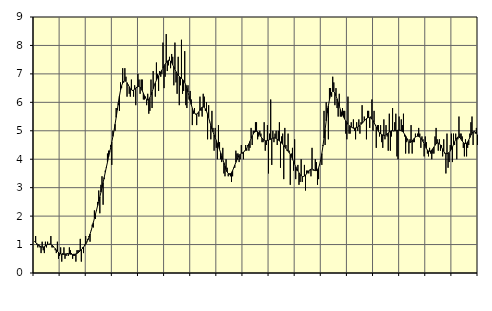
| Category | Piggar | Series 1 |
|---|---|---|
| nan | 1.1 | 1.11 |
| 87.0 | 1.3 | 1.07 |
| 87.0 | 1 | 1.04 |
| 87.0 | 0.9 | 1 |
| 87.0 | 1 | 0.97 |
| 87.0 | 0.9 | 0.95 |
| 87.0 | 0.7 | 0.92 |
| 87.0 | 1.1 | 0.91 |
| 87.0 | 0.8 | 0.91 |
| 87.0 | 0.7 | 0.93 |
| 87.0 | 1.1 | 0.95 |
| 87.0 | 0.9 | 0.98 |
| nan | 1.1 | 1 |
| 88.0 | 1 | 1.01 |
| 88.0 | 1 | 1.02 |
| 88.0 | 1.3 | 1.01 |
| 88.0 | 0.9 | 0.98 |
| 88.0 | 0.9 | 0.95 |
| 88.0 | 0.9 | 0.9 |
| 88.0 | 0.8 | 0.86 |
| 88.0 | 0.7 | 0.81 |
| 88.0 | 1.1 | 0.76 |
| 88.0 | 0.5 | 0.72 |
| 88.0 | 0.6 | 0.69 |
| nan | 0.9 | 0.67 |
| 89.0 | 0.4 | 0.66 |
| 89.0 | 0.7 | 0.65 |
| 89.0 | 0.9 | 0.66 |
| 89.0 | 0.5 | 0.67 |
| 89.0 | 0.6 | 0.67 |
| 89.0 | 0.7 | 0.68 |
| 89.0 | 0.6 | 0.68 |
| 89.0 | 0.9 | 0.67 |
| 89.0 | 0.8 | 0.66 |
| 89.0 | 0.7 | 0.66 |
| 89.0 | 0.5 | 0.65 |
| nan | 0.6 | 0.66 |
| 90.0 | 0.6 | 0.66 |
| 90.0 | 0.4 | 0.67 |
| 90.0 | 0.8 | 0.69 |
| 90.0 | 0.8 | 0.71 |
| 90.0 | 0.8 | 0.74 |
| 90.0 | 1.2 | 0.78 |
| 90.0 | 0.4 | 0.82 |
| 90.0 | 0.9 | 0.86 |
| 90.0 | 0.7 | 0.91 |
| 90.0 | 1 | 0.96 |
| 90.0 | 1.3 | 1.01 |
| nan | 1.1 | 1.08 |
| 91.0 | 1.2 | 1.16 |
| 91.0 | 1.3 | 1.26 |
| 91.0 | 1.1 | 1.37 |
| 91.0 | 1.5 | 1.49 |
| 91.0 | 1.7 | 1.63 |
| 91.0 | 1.6 | 1.77 |
| 91.0 | 2.2 | 1.92 |
| 91.0 | 1.9 | 2.07 |
| 91.0 | 2.2 | 2.22 |
| 91.0 | 2.5 | 2.37 |
| 91.0 | 2.9 | 2.52 |
| nan | 2.1 | 2.67 |
| 92.0 | 3.1 | 2.84 |
| 92.0 | 3.4 | 3.01 |
| 92.0 | 2.4 | 3.18 |
| 92.0 | 3.3 | 3.36 |
| 92.0 | 3.6 | 3.54 |
| 92.0 | 3.7 | 3.72 |
| 92.0 | 4.2 | 3.89 |
| 92.0 | 4.3 | 4.07 |
| 92.0 | 4.3 | 4.24 |
| 92.0 | 4.5 | 4.42 |
| 92.0 | 3.8 | 4.6 |
| nan | 5 | 4.8 |
| 93.0 | 5 | 5 |
| 93.0 | 5 | 5.23 |
| 93.0 | 5.8 | 5.47 |
| 93.0 | 5.8 | 5.73 |
| 93.0 | 5.9 | 5.99 |
| 93.0 | 5.7 | 6.22 |
| 93.0 | 6.7 | 6.42 |
| 93.0 | 6.5 | 6.58 |
| 93.0 | 7.2 | 6.68 |
| 93.0 | 6.7 | 6.74 |
| 93.0 | 7.2 | 6.76 |
| nan | 6.9 | 6.74 |
| 94.0 | 6.2 | 6.69 |
| 94.0 | 6.6 | 6.62 |
| 94.0 | 6.3 | 6.55 |
| 94.0 | 6.2 | 6.48 |
| 94.0 | 6.8 | 6.44 |
| 94.0 | 6.4 | 6.42 |
| 94.0 | 6.2 | 6.43 |
| 94.0 | 6.6 | 6.46 |
| 94.0 | 5.9 | 6.5 |
| 94.0 | 6.5 | 6.54 |
| 94.0 | 7 | 6.56 |
| nan | 6.8 | 6.56 |
| 95.0 | 6.3 | 6.53 |
| 95.0 | 6.8 | 6.48 |
| 95.0 | 6.8 | 6.41 |
| 95.0 | 6.1 | 6.32 |
| 95.0 | 6.1 | 6.23 |
| 95.0 | 6.2 | 6.15 |
| 95.0 | 5.9 | 6.1 |
| 95.0 | 6.3 | 6.08 |
| 95.0 | 5.6 | 6.11 |
| 95.0 | 5.7 | 6.17 |
| 95.0 | 6.8 | 6.26 |
| nan | 5.8 | 6.36 |
| 96.0 | 7.1 | 6.48 |
| 96.0 | 6.6 | 6.59 |
| 96.0 | 6.2 | 6.69 |
| 96.0 | 7.4 | 6.78 |
| 96.0 | 7 | 6.86 |
| 96.0 | 6.4 | 6.93 |
| 96.0 | 7.1 | 7 |
| 96.0 | 6.9 | 7.06 |
| 96.0 | 7 | 7.13 |
| 96.0 | 8.1 | 7.2 |
| 96.0 | 6.5 | 7.28 |
| nan | 6.9 | 7.34 |
| 97.0 | 8.4 | 7.4 |
| 97.0 | 7.1 | 7.45 |
| 97.0 | 7.3 | 7.48 |
| 97.0 | 7.6 | 7.48 |
| 97.0 | 7.2 | 7.45 |
| 97.0 | 7.7 | 7.4 |
| 97.0 | 7.6 | 7.32 |
| 97.0 | 6.6 | 7.24 |
| 97.0 | 8.1 | 7.16 |
| 97.0 | 6.7 | 7.08 |
| 97.0 | 6.3 | 7.01 |
| nan | 7.6 | 6.96 |
| 98.0 | 5.9 | 6.91 |
| 98.0 | 6.6 | 6.88 |
| 98.0 | 8.2 | 6.84 |
| 98.0 | 6.3 | 6.81 |
| 98.0 | 6.4 | 6.76 |
| 98.0 | 7.8 | 6.7 |
| 98.0 | 5.9 | 6.61 |
| 98.0 | 5.8 | 6.49 |
| 98.0 | 6.6 | 6.36 |
| 98.0 | 6.1 | 6.21 |
| 98.0 | 6.4 | 6.06 |
| nan | 6.1 | 5.92 |
| 99.0 | 5.2 | 5.79 |
| 99.0 | 5.6 | 5.69 |
| 99.0 | 5.8 | 5.62 |
| 99.0 | 5.6 | 5.58 |
| 99.0 | 5.2 | 5.59 |
| 99.0 | 5.6 | 5.62 |
| 99.0 | 5.5 | 5.67 |
| 99.0 | 6.2 | 5.73 |
| 99.0 | 5.7 | 5.79 |
| 99.0 | 5.5 | 5.83 |
| 99.0 | 6.3 | 5.84 |
| nan | 6.2 | 5.82 |
| 0.0 | 5.7 | 5.77 |
| 0.0 | 6 | 5.69 |
| 0.0 | 4.7 | 5.58 |
| 0.0 | 5.9 | 5.46 |
| 0.0 | 5.3 | 5.32 |
| 0.0 | 4.7 | 5.19 |
| 0.0 | 5.7 | 5.07 |
| 0.0 | 5.1 | 4.96 |
| 0.0 | 4.3 | 4.85 |
| 0.0 | 5.1 | 4.76 |
| 0.0 | 4.4 | 4.66 |
| nan | 4 | 4.56 |
| 1.0 | 5.2 | 4.45 |
| 1.0 | 4.6 | 4.34 |
| 1.0 | 4 | 4.23 |
| 1.0 | 3.9 | 4.12 |
| 1.0 | 4.4 | 4 |
| 1.0 | 3.5 | 3.88 |
| 1.0 | 3.4 | 3.76 |
| 1.0 | 4 | 3.64 |
| 1.0 | 3.7 | 3.55 |
| 1.0 | 3.4 | 3.5 |
| 1.0 | 3.5 | 3.47 |
| nan | 3.4 | 3.49 |
| 2.0 | 3.2 | 3.53 |
| 2.0 | 3.4 | 3.6 |
| 2.0 | 3.7 | 3.69 |
| 2.0 | 3.7 | 3.79 |
| 2.0 | 4.3 | 3.89 |
| 2.0 | 4.2 | 3.98 |
| 2.0 | 4.2 | 4.07 |
| 2.0 | 3.9 | 4.13 |
| 2.0 | 4 | 4.18 |
| 2.0 | 4.5 | 4.21 |
| 2.0 | 4.2 | 4.23 |
| nan | 4 | 4.25 |
| 3.0 | 4.3 | 4.28 |
| 3.0 | 4.5 | 4.32 |
| 3.0 | 4.3 | 4.38 |
| 3.0 | 4.5 | 4.46 |
| 3.0 | 4.3 | 4.54 |
| 3.0 | 4.4 | 4.63 |
| 3.0 | 5.1 | 4.73 |
| 3.0 | 4.5 | 4.82 |
| 3.0 | 5 | 4.89 |
| 3.0 | 5 | 4.95 |
| 3.0 | 5.3 | 4.97 |
| nan | 5.3 | 4.98 |
| 4.0 | 4.7 | 4.97 |
| 4.0 | 4.8 | 4.92 |
| 4.0 | 5 | 4.87 |
| 4.0 | 4.9 | 4.8 |
| 4.0 | 4.6 | 4.74 |
| 4.0 | 4.6 | 4.7 |
| 4.0 | 5.3 | 4.67 |
| 4.0 | 4.3 | 4.65 |
| 4.0 | 4.5 | 4.65 |
| 4.0 | 5.2 | 4.66 |
| 4.0 | 3.5 | 4.67 |
| nan | 4.9 | 4.69 |
| 5.0 | 6.1 | 4.7 |
| 5.0 | 3.8 | 4.72 |
| 5.0 | 5 | 4.74 |
| 5.0 | 4.6 | 4.75 |
| 5.0 | 4.9 | 4.75 |
| 5.0 | 5 | 4.73 |
| 5.0 | 4.5 | 4.71 |
| 5.0 | 5 | 4.67 |
| 5.0 | 5.3 | 4.64 |
| 5.0 | 3.7 | 4.61 |
| 5.0 | 4.8 | 4.57 |
| nan | 4.9 | 4.53 |
| 6.0 | 3.3 | 4.48 |
| 6.0 | 5.1 | 4.43 |
| 6.0 | 4.5 | 4.38 |
| 6.0 | 4.3 | 4.33 |
| 6.0 | 4.9 | 4.28 |
| 6.0 | 4.3 | 4.23 |
| 6.0 | 3.1 | 4.17 |
| 6.0 | 4.2 | 4.09 |
| 6.0 | 4.4 | 4.01 |
| 6.0 | 3.6 | 3.92 |
| 6.0 | 4.7 | 3.83 |
| nan | 3.3 | 3.74 |
| 7.0 | 3.6 | 3.66 |
| 7.0 | 3.8 | 3.59 |
| 7.0 | 3.1 | 3.52 |
| 7.0 | 3.2 | 3.46 |
| 7.0 | 4 | 3.42 |
| 7.0 | 3.2 | 3.39 |
| 7.0 | 3.4 | 3.39 |
| 7.0 | 3.8 | 3.41 |
| 7.0 | 2.9 | 3.44 |
| 7.0 | 3.6 | 3.49 |
| 7.0 | 3.6 | 3.54 |
| nan | 3.5 | 3.59 |
| 8.0 | 3.6 | 3.63 |
| 8.0 | 3.4 | 3.65 |
| 8.0 | 4.4 | 3.66 |
| 8.0 | 3.6 | 3.64 |
| 8.0 | 3.6 | 3.62 |
| 8.0 | 4 | 3.6 |
| 8.0 | 3.9 | 3.6 |
| 8.0 | 3.1 | 3.63 |
| 8.0 | 3.3 | 3.7 |
| 8.0 | 3.8 | 3.82 |
| 8.0 | 4 | 3.99 |
| nan | 3.8 | 4.2 |
| 9.0 | 4.5 | 4.46 |
| 9.0 | 5.7 | 4.74 |
| 9.0 | 4.5 | 5.04 |
| 9.0 | 6 | 5.35 |
| 9.0 | 5.8 | 5.63 |
| 9.0 | 4.7 | 5.88 |
| 9.0 | 6.5 | 6.09 |
| 9.0 | 6.5 | 6.25 |
| 9.0 | 6.2 | 6.35 |
| 9.0 | 6.9 | 6.39 |
| 9.0 | 6.7 | 6.38 |
| nan | 5.9 | 6.32 |
| 10.0 | 6.5 | 6.23 |
| 10.0 | 5.8 | 6.12 |
| 10.0 | 5.5 | 5.99 |
| 10.0 | 6.3 | 5.87 |
| 10.0 | 5.5 | 5.75 |
| 10.0 | 5.5 | 5.65 |
| 10.0 | 5.8 | 5.56 |
| 10.0 | 5.7 | 5.48 |
| 10.0 | 5.7 | 5.41 |
| 10.0 | 4.9 | 5.35 |
| 10.0 | 4.7 | 5.29 |
| nan | 6.2 | 5.23 |
| 11.0 | 4.9 | 5.19 |
| 11.0 | 4.9 | 5.15 |
| 11.0 | 5.3 | 5.13 |
| 11.0 | 5.1 | 5.11 |
| 11.0 | 5.4 | 5.09 |
| 11.0 | 5 | 5.09 |
| 11.0 | 4.7 | 5.1 |
| 11.0 | 5.3 | 5.11 |
| 11.0 | 5 | 5.13 |
| 11.0 | 5.4 | 5.16 |
| 11.0 | 4.9 | 5.19 |
| nan | 5.3 | 5.23 |
| 12.0 | 5.9 | 5.26 |
| 12.0 | 5.3 | 5.3 |
| 12.0 | 5.5 | 5.35 |
| 12.0 | 5.4 | 5.39 |
| 12.0 | 4.7 | 5.43 |
| 12.0 | 5.7 | 5.45 |
| 12.0 | 5.7 | 5.47 |
| 12.0 | 5.1 | 5.46 |
| 12.0 | 5.5 | 5.45 |
| 12.0 | 6.1 | 5.41 |
| 12.0 | 5 | 5.36 |
| nan | 5.7 | 5.29 |
| 13.0 | 5.2 | 5.21 |
| 13.0 | 4.4 | 5.13 |
| 13.0 | 5.2 | 5.05 |
| 13.0 | 5.2 | 4.98 |
| 13.0 | 4.8 | 4.93 |
| 13.0 | 5.2 | 4.89 |
| 13.0 | 4.6 | 4.87 |
| 13.0 | 4.4 | 4.85 |
| 13.0 | 5.4 | 4.84 |
| 13.0 | 4.7 | 4.84 |
| 13.0 | 5.2 | 4.86 |
| nan | 4.8 | 4.89 |
| 14.0 | 4.3 | 4.92 |
| 14.0 | 5.6 | 4.96 |
| 14.0 | 4.3 | 4.98 |
| 14.0 | 4.8 | 5 |
| 14.0 | 5.8 | 5 |
| 14.0 | 5 | 4.99 |
| 14.0 | 5.3 | 5 |
| 14.0 | 5.6 | 5 |
| 14.0 | 4.1 | 5.01 |
| 14.0 | 4 | 5.02 |
| 14.0 | 5.5 | 5.02 |
| nan | 5 | 5.02 |
| 15.0 | 5.4 | 5 |
| 15.0 | 5.2 | 4.98 |
| 15.0 | 5.6 | 4.94 |
| 15.0 | 4.8 | 4.88 |
| 15.0 | 4.2 | 4.82 |
| 15.0 | 4.6 | 4.74 |
| 15.0 | 4.7 | 4.67 |
| 15.0 | 4.2 | 4.62 |
| 15.0 | 4.7 | 4.59 |
| 15.0 | 5.2 | 4.6 |
| 15.0 | 4.2 | 4.64 |
| nan | 4.6 | 4.69 |
| 16.0 | 4.6 | 4.74 |
| 16.0 | 4.9 | 4.78 |
| 16.0 | 4.8 | 4.8 |
| 16.0 | 4.9 | 4.81 |
| 16.0 | 5.1 | 4.8 |
| 16.0 | 4.9 | 4.78 |
| 16.0 | 4.4 | 4.74 |
| 16.0 | 4.8 | 4.69 |
| 16.0 | 4.7 | 4.62 |
| 16.0 | 4.1 | 4.54 |
| 16.0 | 4.8 | 4.46 |
| nan | 4.6 | 4.38 |
| 17.0 | 4.2 | 4.32 |
| 17.0 | 4.1 | 4.29 |
| 17.0 | 4.4 | 4.28 |
| 17.0 | 4.2 | 4.29 |
| 17.0 | 4 | 4.32 |
| 17.0 | 4.2 | 4.37 |
| 17.0 | 4.2 | 4.43 |
| 17.0 | 4.8 | 4.49 |
| 17.0 | 5.1 | 4.54 |
| 17.0 | 4.7 | 4.57 |
| 17.0 | 4.3 | 4.57 |
| nan | 4.7 | 4.55 |
| 18.0 | 4.3 | 4.49 |
| 18.0 | 4.5 | 4.42 |
| 18.0 | 4.1 | 4.35 |
| 18.0 | 4.7 | 4.28 |
| 18.0 | 4.2 | 4.22 |
| 18.0 | 3.5 | 4.2 |
| 18.0 | 4.9 | 4.19 |
| 18.0 | 3.7 | 4.21 |
| 18.0 | 3.9 | 4.24 |
| 18.0 | 4.5 | 4.29 |
| 18.0 | 4.9 | 4.35 |
| nan | 3.9 | 4.43 |
| 19.0 | 4.9 | 4.52 |
| 19.0 | 4.5 | 4.61 |
| 19.0 | 4.9 | 4.69 |
| 19.0 | 4 | 4.75 |
| 19.0 | 4.7 | 4.78 |
| 19.0 | 5.5 | 4.78 |
| 19.0 | 4.9 | 4.75 |
| 19.0 | 4.9 | 4.7 |
| 19.0 | 4.8 | 4.64 |
| 19.0 | 4.4 | 4.59 |
| 19.0 | 4.1 | 4.56 |
| nan | 4.7 | 4.55 |
| 20.0 | 4.1 | 4.56 |
| 20.0 | 4.4 | 4.61 |
| 20.0 | 4.5 | 4.68 |
| 20.0 | 4.9 | 4.76 |
| 20.0 | 5.3 | 4.85 |
| 20.0 | 5.5 | 4.91 |
| 20.0 | 4.5 | 4.96 |
| 20.0 | 5 | 4.97 |
| 20.0 | 4.9 | 4.95 |
| 20.0 | 5.1 | 4.92 |
| 20.0 | 4.5 | 4.86 |